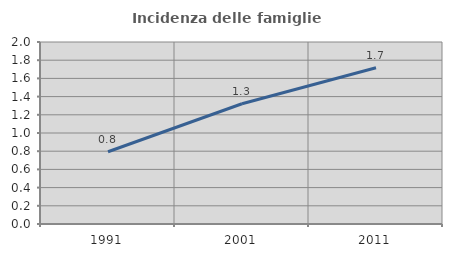
| Category | Incidenza delle famiglie numerose |
|---|---|
| 1991.0 | 0.794 |
| 2001.0 | 1.322 |
| 2011.0 | 1.717 |